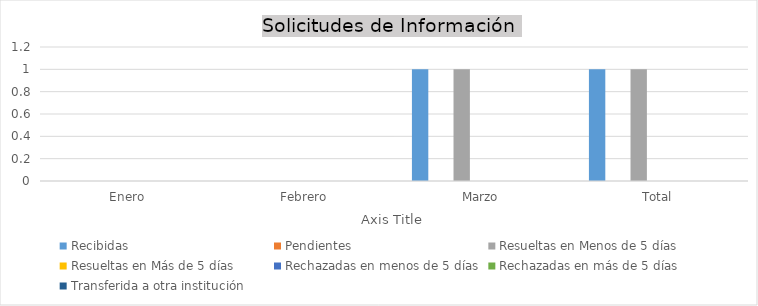
| Category | Recibidas  | Pendientes  | Resueltas en Menos de 5 días | Resueltas en Más de 5 días | Rechazadas en menos de 5 días | Rechazadas en más de 5 días | Transferida a otra institución |
|---|---|---|---|---|---|---|---|
| Enero | 0 | 0 | 0 | 0 | 0 | 0 | 0 |
| Febrero | 0 | 0 | 0 | 0 | 0 | 0 | 0 |
| Marzo | 1 | 0 | 1 | 0 | 0 | 0 | 0 |
| Total | 1 | 0 | 1 | 0 | 0 | 0 | 0 |